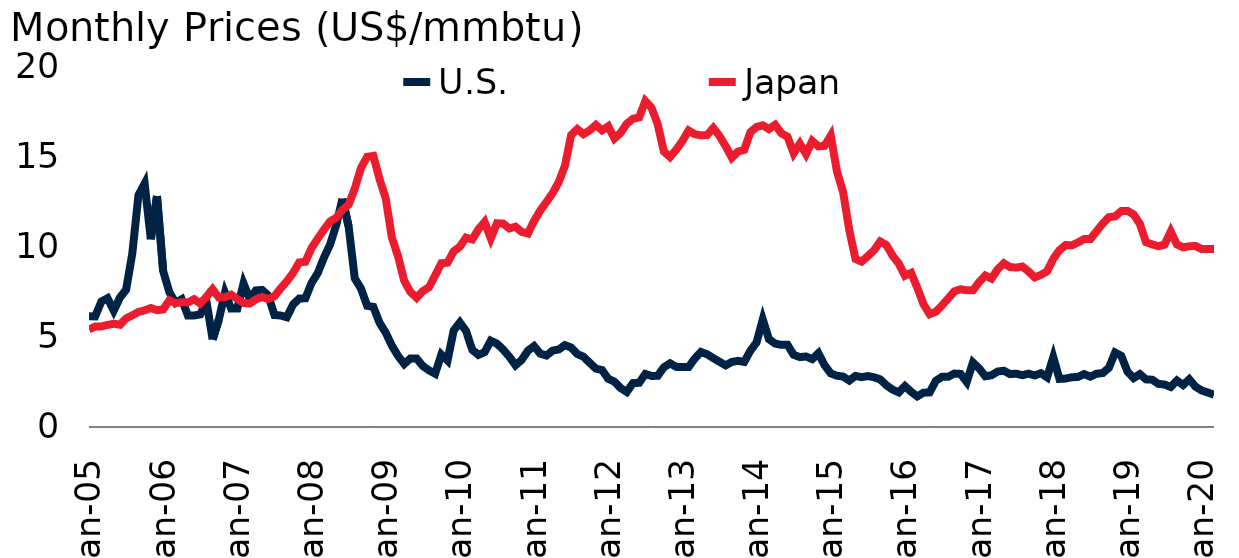
| Category | U.S. | Japan |
|---|---|---|
| 2005-01-01 | 6.155 | 5.42 |
| 2005-02-01 | 6.145 | 5.58 |
| 2005-03-01 | 6.968 | 5.59 |
| 2005-04-01 | 7.153 | 5.67 |
| 2005-05-01 | 6.469 | 5.74 |
| 2005-06-01 | 7.186 | 5.68 |
| 2005-07-01 | 7.626 | 6.03 |
| 2005-08-01 | 9.63 | 6.2 |
| 2005-09-01 | 12.876 | 6.39 |
| 2005-10-01 | 13.523 | 6.48 |
| 2005-11-01 | 10.431 | 6.61 |
| 2005-12-01 | 12.828 | 6.49 |
| 2006-01-01 | 8.661 | 6.53 |
| 2006-02-01 | 7.488 | 7.04 |
| 2006-03-01 | 6.899 | 6.88 |
| 2006-04-01 | 7.094 | 6.93 |
| 2006-05-01 | 6.198 | 6.92 |
| 2006-06-01 | 6.193 | 7.1 |
| 2006-07-01 | 6.25 | 6.86 |
| 2006-08-01 | 6.995 | 7.23 |
| 2006-09-01 | 4.862 | 7.65 |
| 2006-10-01 | 5.962 | 7.2 |
| 2006-11-01 | 7.454 | 7.21 |
| 2006-12-01 | 6.578 | 7.35 |
| 2007-01-01 | 6.584 | 7.11 |
| 2007-02-01 | 7.972 | 6.89 |
| 2007-03-01 | 7.123 | 6.86 |
| 2007-04-01 | 7.587 | 7.09 |
| 2007-05-01 | 7.613 | 7.22 |
| 2007-06-01 | 7.304 | 7.11 |
| 2007-07-01 | 6.221 | 7.26 |
| 2007-08-01 | 6.195 | 7.7 |
| 2007-09-01 | 6.096 | 8.09 |
| 2007-10-01 | 6.798 | 8.55 |
| 2007-11-01 | 7.138 | 9.14 |
| 2007-12-01 | 7.15 | 9.18 |
| 2008-01-01 | 8 | 9.94 |
| 2008-02-01 | 8.55 | 10.46 |
| 2008-03-01 | 9.401 | 10.96 |
| 2008-04-01 | 10.132 | 11.42 |
| 2008-05-01 | 11.23 | 11.63 |
| 2008-06-01 | 12.676 | 12.07 |
| 2008-07-01 | 11.149 | 12.35 |
| 2008-08-01 | 8.25 | 13.25 |
| 2008-09-01 | 7.694 | 14.39 |
| 2008-10-01 | 6.734 | 15.01 |
| 2008-11-01 | 6.674 | 15.06 |
| 2008-12-01 | 5.795 | 13.78 |
| 2009-01-01 | 5.241 | 12.71 |
| 2009-02-01 | 4.519 | 10.52 |
| 2009-03-01 | 3.95 | 9.48 |
| 2009-04-01 | 3.5 | 8.12 |
| 2009-05-01 | 3.81 | 7.5 |
| 2009-06-01 | 3.804 | 7.18 |
| 2009-07-01 | 3.39 | 7.55 |
| 2009-08-01 | 3.148 | 7.76 |
| 2009-09-01 | 2.962 | 8.42 |
| 2009-10-01 | 4.023 | 9.1 |
| 2009-11-01 | 3.691 | 9.13 |
| 2009-12-01 | 5.365 | 9.76 |
| 2010-01-01 | 5.807 | 10.02 |
| 2010-02-01 | 5.336 | 10.52 |
| 2010-03-01 | 4.292 | 10.42 |
| 2010-04-01 | 4.006 | 10.98 |
| 2010-05-01 | 4.156 | 11.39 |
| 2010-06-01 | 4.795 | 10.48 |
| 2010-07-01 | 4.627 | 11.32 |
| 2010-08-01 | 4.305 | 11.3 |
| 2010-09-01 | 3.904 | 11.03 |
| 2010-10-01 | 3.432 | 11.13 |
| 2010-11-01 | 3.727 | 10.84 |
| 2010-12-01 | 4.237 | 10.75 |
| 2011-01-01 | 4.493 | 11.45 |
| 2011-02-01 | 4.075 | 12.02 |
| 2011-03-01 | 3.971 | 12.5 |
| 2011-04-01 | 4.242 | 12.99 |
| 2011-05-01 | 4.309 | 13.61 |
| 2011-06-01 | 4.549 | 14.52 |
| 2011-07-01 | 4.413 | 16.22 |
| 2011-08-01 | 4.054 | 16.55 |
| 2011-09-01 | 3.901 | 16.27 |
| 2011-10-01 | 3.568 | 16.48 |
| 2011-11-01 | 3.242 | 16.78 |
| 2011-12-01 | 3.164 | 16.48 |
| 2012-01-01 | 2.68 | 16.71 |
| 2012-02-01 | 2.519 | 16.03 |
| 2012-03-01 | 2.166 | 16.34 |
| 2012-04-01 | 1.947 | 16.85 |
| 2012-05-01 | 2.437 | 17.12 |
| 2012-06-01 | 2.455 | 17.2 |
| 2012-07-01 | 2.946 | 18.11 |
| 2012-08-01 | 2.838 | 17.74 |
| 2012-09-01 | 2.842 | 16.83 |
| 2012-10-01 | 3.317 | 15.3 |
| 2012-11-01 | 3.538 | 15 |
| 2012-12-01 | 3.34 | 15.41 |
| 2013-01-01 | 3.328 | 15.89 |
| 2013-02-01 | 3.329 | 16.47 |
| 2013-03-01 | 3.807 | 16.27 |
| 2013-04-01 | 4.167 | 16.2 |
| 2013-05-01 | 4.04 | 16.22 |
| 2013-06-01 | 3.825 | 16.61 |
| 2013-07-01 | 3.623 | 16.17 |
| 2013-08-01 | 3.425 | 15.6 |
| 2013-09-01 | 3.615 | 14.96 |
| 2013-10-01 | 3.674 | 15.3 |
| 2013-11-01 | 3.617 | 15.4 |
| 2013-12-01 | 4.237 | 16.38 |
| 2014-01-01 | 4.701 | 16.67 |
| 2014-02-01 | 5.973 | 16.76 |
| 2014-03-01 | 4.878 | 16.55 |
| 2014-04-01 | 4.634 | 16.79 |
| 2014-05-01 | 4.562 | 16.32 |
| 2014-06-01 | 4.569 | 16.13 |
| 2014-07-01 | 4.01 | 15.209 |
| 2014-08-01 | 3.884 | 15.74 |
| 2014-09-01 | 3.917 | 15.16 |
| 2014-10-01 | 3.772 | 15.89 |
| 2014-11-01 | 4.1 | 15.59 |
| 2014-12-01 | 3.433 | 15.62 |
| 2015-01-01 | 2.974 | 16.187 |
| 2015-02-01 | 2.848 | 14.204 |
| 2015-03-01 | 2.801 | 13.041 |
| 2015-04-01 | 2.58 | 10.937 |
| 2015-05-01 | 2.838 | 9.337 |
| 2015-06-01 | 2.769 | 9.189 |
| 2015-07-01 | 2.83 | 9.495 |
| 2015-08-01 | 2.763 | 9.816 |
| 2015-09-01 | 2.646 | 10.307 |
| 2015-10-01 | 2.315 | 10.107 |
| 2015-11-01 | 2.078 | 9.516 |
| 2015-12-01 | 1.923 | 9.08 |
| 2016-01-01 | 2.274 | 8.402 |
| 2016-02-01 | 1.957 | 8.562 |
| 2016-03-01 | 1.702 | 7.737 |
| 2016-04-01 | 1.905 | 6.825 |
| 2016-05-01 | 1.922 | 6.269 |
| 2016-06-01 | 2.567 | 6.402 |
| 2016-07-01 | 2.788 | 6.757 |
| 2016-08-01 | 2.791 | 7.139 |
| 2016-09-01 | 2.969 | 7.54 |
| 2016-10-01 | 2.949 | 7.653 |
| 2016-11-01 | 2.501 | 7.593 |
| 2016-12-01 | 3.582 | 7.592 |
| 2017-01-01 | 3.261 | 8.042 |
| 2017-02-01 | 2.82 | 8.415 |
| 2017-03-01 | 2.874 | 8.246 |
| 2017-04-01 | 3.082 | 8.763 |
| 2017-05-01 | 3.124 | 9.097 |
| 2017-06-01 | 2.939 | 8.883 |
| 2017-07-01 | 2.961 | 8.858 |
| 2017-08-01 | 2.876 | 8.915 |
| 2017-09-01 | 2.963 | 8.642 |
| 2017-10-01 | 2.865 | 8.314 |
| 2017-11-01 | 2.991 | 8.451 |
| 2017-12-01 | 2.758 | 8.647 |
| 2018-01-01 | 3.88 | 9.342 |
| 2018-02-01 | 2.672 | 9.826 |
| 2018-03-01 | 2.692 | 10.11 |
| 2018-04-01 | 2.762 | 10.09 |
| 2018-05-01 | 2.784 | 10.252 |
| 2018-06-01 | 2.939 | 10.443 |
| 2018-07-01 | 2.798 | 10.441 |
| 2018-08-01 | 2.959 | 10.875 |
| 2018-09-01 | 2.998 | 11.303 |
| 2018-10-01 | 3.288 | 11.661 |
| 2018-11-01 | 4.135 | 11.7 |
| 2018-12-01 | 3.954 | 11.995 |
| 2019-01-01 | 3.08 | 12.007 |
| 2019-02-01 | 2.717 | 11.807 |
| 2019-03-01 | 2.935 | 11.294 |
| 2019-04-01 | 2.646 | 10.265 |
| 2019-05-01 | 2.628 | 10.145 |
| 2019-06-01 | 2.396 | 10.042 |
| 2019-07-01 | 2.36 | 10.128 |
| 2019-08-01 | 2.224 | 10.861 |
| 2019-09-01 | 2.58 | 10.142 |
| 2019-10-01 | 2.331 | 9.984 |
| 2019-11-01 | 2.65 | 10.04 |
| 2019-12-01 | 2.242 | 10.057 |
| 2020-01-01 | 2.03 | 9.887 |
| 2020-02-01 | 1.916 | 9.887 |
| 2020-03-01 | 1.793 | 9.887 |